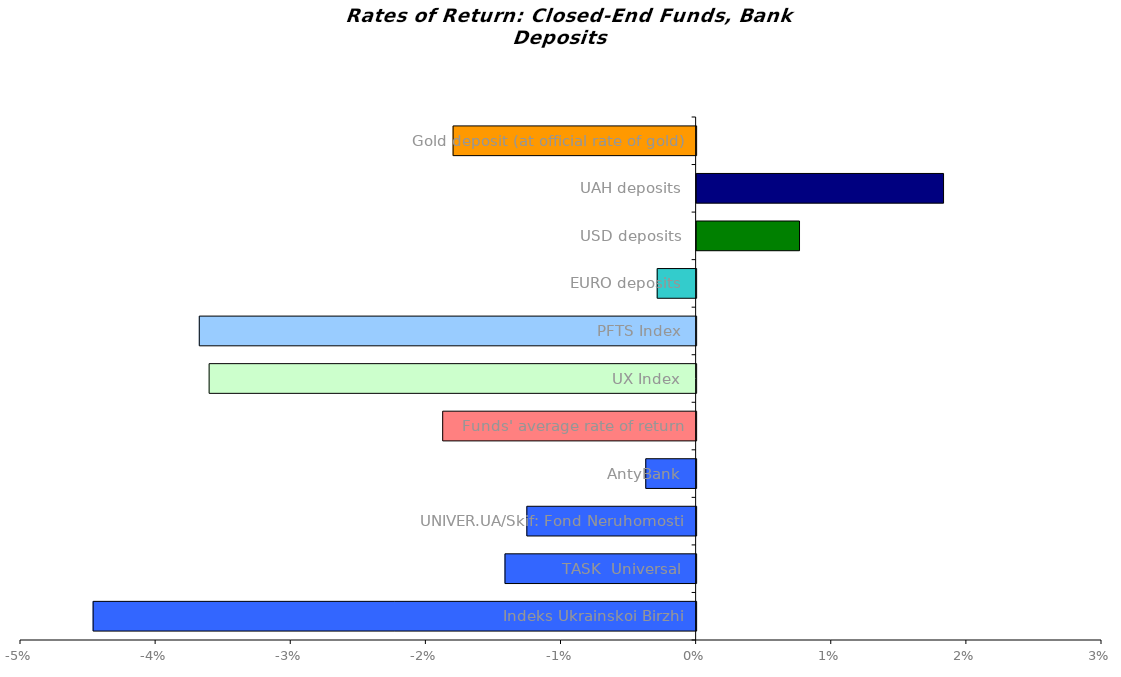
| Category | Series 0 |
|---|---|
| Indeks Ukrainskoi Birzhi | -0.045 |
| TASK  Universal | -0.014 |
| UNIVER.UA/Skif: Fond Neruhomosti | -0.013 |
| AntyBank | -0.004 |
| Funds' average rate of return | -0.019 |
| UX Index | -0.036 |
| PFTS Index | -0.037 |
| EURO deposits | -0.003 |
| USD deposits | 0.008 |
| UAH deposits | 0.018 |
| Gold deposit (at official rate of gold) | -0.018 |